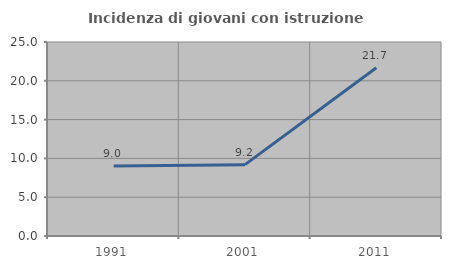
| Category | Incidenza di giovani con istruzione universitaria |
|---|---|
| 1991.0 | 9.009 |
| 2001.0 | 9.195 |
| 2011.0 | 21.687 |